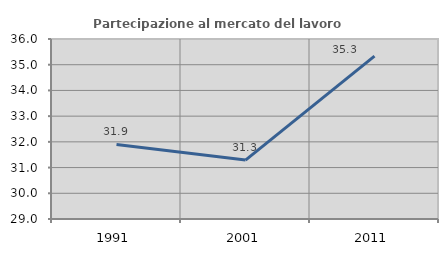
| Category | Partecipazione al mercato del lavoro  femminile |
|---|---|
| 1991.0 | 31.9 |
| 2001.0 | 31.291 |
| 2011.0 | 35.336 |